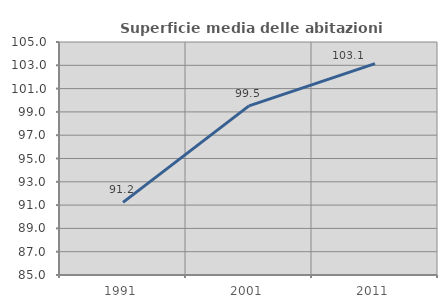
| Category | Superficie media delle abitazioni occupate |
|---|---|
| 1991.0 | 91.236 |
| 2001.0 | 99.513 |
| 2011.0 | 103.148 |